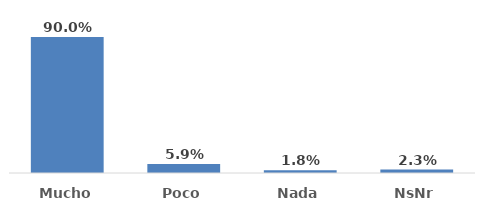
| Category | Series 0 |
|---|---|
| Mucho  | 0.9 |
| Poco | 0.059 |
| Nada | 0.018 |
| NsNr | 0.023 |